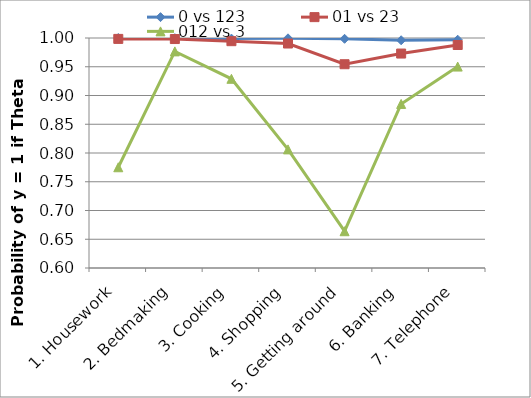
| Category | 0 vs 123 | 01 vs 23 | 012 vs 3 |
|---|---|---|---|
| 1. Housework | 1 | 0.998 | 0.775 |
| 2. Bedmaking | 1 | 0.998 | 0.977 |
| 3. Cooking | 0.999 | 0.994 | 0.929 |
| 4. Shopping | 0.999 | 0.99 | 0.806 |
| 5. Getting around | 0.999 | 0.954 | 0.664 |
| 6. Banking | 0.996 | 0.973 | 0.885 |
| 7. Telephone | 0.997 | 0.988 | 0.95 |